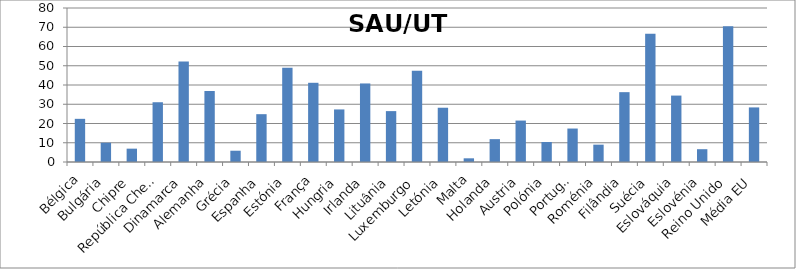
| Category | Series 0 |
|---|---|
| Bélgica | 22.424 |
| Bulgária | 10.004 |
| Chipre | 6.93 |
| República Checa | 31.046 |
| Dinamarca | 52.259 |
| Alemanha | 36.874 |
| Grécia | 5.86 |
| Espanha | 24.844 |
| Estónia | 48.94 |
| França | 41.148 |
| Hungria | 27.307 |
| Irlanda | 40.804 |
| Lituânia | 26.435 |
| Luxemburgo | 47.444 |
| Letónia | 28.19 |
| Malta | 1.915 |
| Holanda | 11.876 |
| Austria | 21.522 |
| Polónia | 10.392 |
| Portugal | 17.382 |
| Roménia | 9.007 |
| Filândia | 36.283 |
| Suécia | 66.578 |
| Eslováquia | 34.506 |
| Eslovénia | 6.651 |
| Reino Unido | 70.568 |
| Média EU | 28.353 |